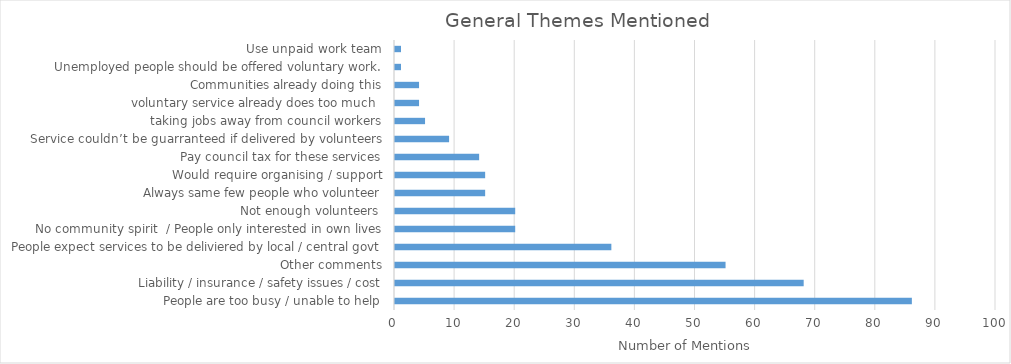
| Category | Series 0 |
|---|---|
| People are too busy / unable to help | 86 |
| Liability / insurance / safety issues / cost | 68 |
| Other comments | 55 |
| People expect services to be deliviered by local / central govt | 36 |
| No community spirit  / People only interested in own lives | 20 |
| Not enough volunteers  | 20 |
| Always same few people who volunteer | 15 |
| Would require organising / support | 15 |
| Pay council tax for these services | 14 |
| Service couldn’t be guarranteed if delivered by volunteers | 9 |
| taking jobs away from council workers | 5 |
| voluntary service already does too much  | 4 |
| Communities already doing this | 4 |
| Unemployed people should be offered voluntary work. | 1 |
| Use unpaid work team | 1 |